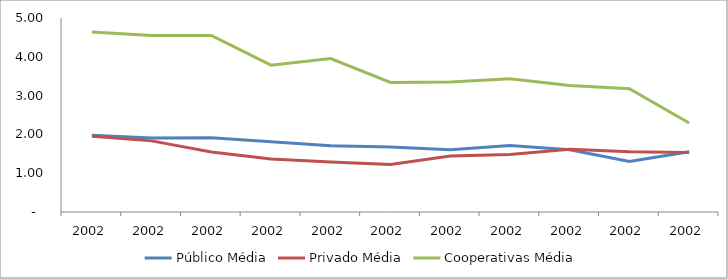
| Category | Público Média | Privado Média | Cooperativas Média |
|---|---|---|---|
| 2002.0 | 1.977 | 1.955 | 4.637 |
| 2002.0 | 1.908 | 1.833 | 4.547 |
| 2002.0 | 1.912 | 1.547 | 4.549 |
| 2002.0 | 1.81 | 1.365 | 3.785 |
| 2002.0 | 1.706 | 1.291 | 3.954 |
| 2002.0 | 1.677 | 1.224 | 3.339 |
| 2002.0 | 1.604 | 1.441 | 3.353 |
| 2002.0 | 1.714 | 1.485 | 3.434 |
| 2002.0 | 1.604 | 1.615 | 3.262 |
| 2002.0 | 1.3 | 1.555 | 3.179 |
| 2002.0 | 1.55 | 1.536 | 2.296 |